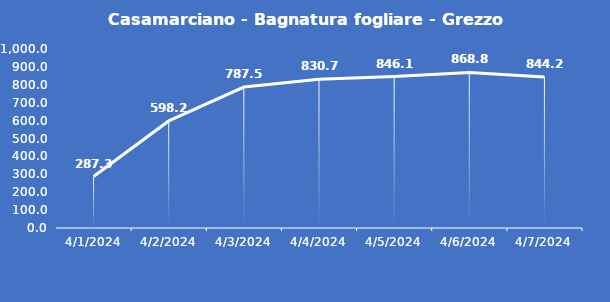
| Category | Casamarciano - Bagnatura fogliare - Grezzo (min) |
|---|---|
| 4/1/24 | 287.3 |
| 4/2/24 | 598.2 |
| 4/3/24 | 787.5 |
| 4/4/24 | 830.7 |
| 4/5/24 | 846.1 |
| 4/6/24 | 868.8 |
| 4/7/24 | 844.2 |